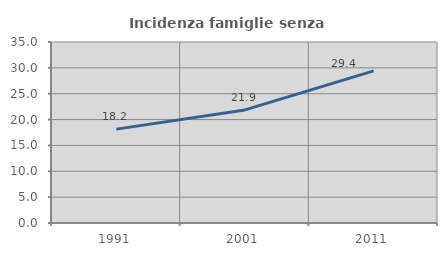
| Category | Incidenza famiglie senza nuclei |
|---|---|
| 1991.0 | 18.155 |
| 2001.0 | 21.868 |
| 2011.0 | 29.412 |